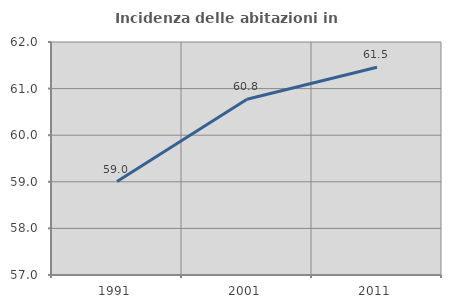
| Category | Incidenza delle abitazioni in proprietà  |
|---|---|
| 1991.0 | 59.005 |
| 2001.0 | 60.773 |
| 2011.0 | 61.458 |